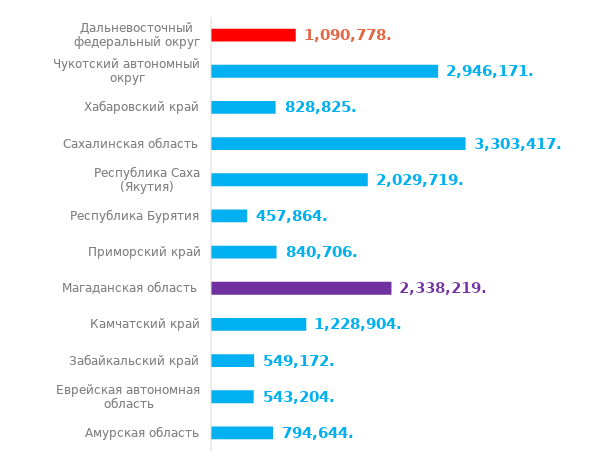
| Category | Series 0 |
|---|---|
| Амурская область | 794644.1 |
| Еврейская автономная область | 543204.8 |
| Забайкальский край | 549172 |
| Камчатский край | 1228904.5 |
| Магаданская область | 2338219.1 |
| Приморский край | 840706.9 |
| Республика Бурятия | 457864.5 |
| Республика Саха (Якутия) | 2029719.8 |
| Сахалинская область | 3303417 |
| Хабаровский край | 828825.8 |
| Чукотский автономный округ | 2946171.5 |
| Дальневосточный федеральный округ | 1090778.1 |